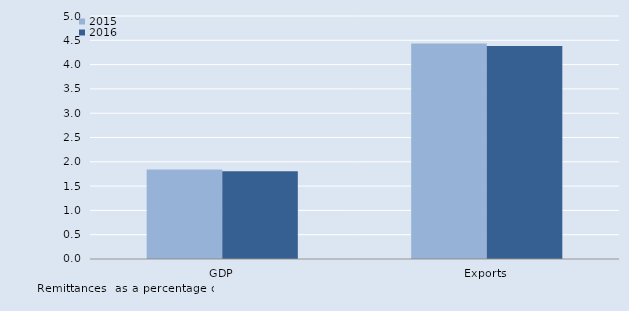
| Category | 2015 | 2016 |
|---|---|---|
| GDP | 1.844 | 1.805 |
| Exports | 4.432 | 4.381 |